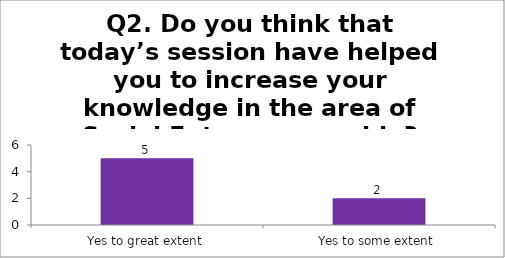
| Category | Q2. Do you think that today’s session have helped you to increase your knowledge in the area of Social Entrepreneurship? |
|---|---|
| Yes to great extent | 5 |
| Yes to some extent | 2 |